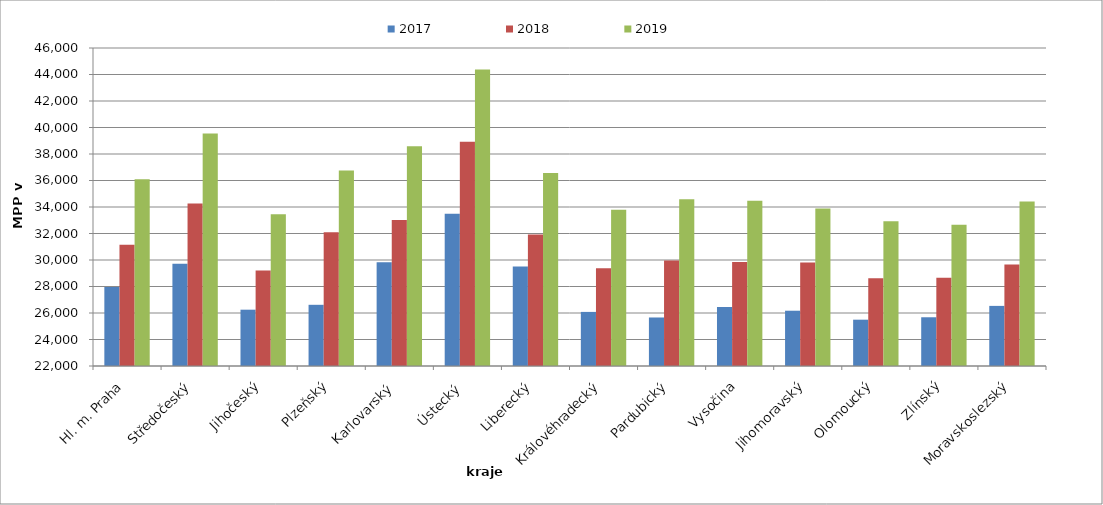
| Category | 2017 | 2018 | 2019 |
|---|---|---|---|
| Hl. m. Praha | 27957.41 | 31155.046 | 36093.86 |
| Středočeský | 29712.528 | 34266.541 | 39539.722 |
| Jihočeský | 26250.327 | 29216.967 | 33453.052 |
| Plzeňský | 26618.366 | 32089.788 | 36761.73 |
| Karlovarský  | 29835.545 | 33010.814 | 38582.512 |
| Ústecký   | 33490.066 | 38918.988 | 44368.295 |
| Liberecký | 29501.045 | 31920.659 | 36568.15 |
| Královéhradecký | 26082.474 | 29384.536 | 33791.753 |
| Pardubický | 25661.597 | 29954.449 | 34583.803 |
| Vysočina | 26460.99 | 29848.596 | 34475.256 |
| Jihomoravský | 26172.113 | 29817.28 | 33880.24 |
| Olomoucký | 25495.918 | 28631.633 | 32926.531 |
| Zlínský | 25678.024 | 28651.067 | 32661.789 |
| Moravskoslezský | 26536.524 | 29662.633 | 34407.441 |